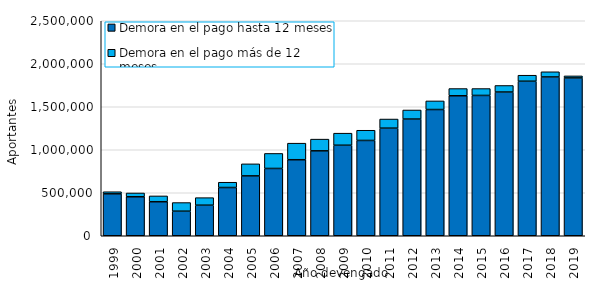
| Category | Demora en el pago hasta 12 meses | Demora en el pago más de 12 meses |
|---|---|---|
| 1999.0 | 487629 | 24284 |
| 2000.0 | 453455 | 43841 |
| 2001.0 | 395644 | 67614 |
| 2002.0 | 285472 | 100591 |
| 2003.0 | 355516 | 87523 |
| 2004.0 | 561027 | 61353 |
| 2005.0 | 696289 | 139739 |
| 2006.0 | 782437 | 174741 |
| 2007.0 | 883974 | 192558 |
| 2008.0 | 987323 | 136351 |
| 2009.0 | 1052552 | 140322 |
| 2010.0 | 1108255 | 118491 |
| 2011.0 | 1251129 | 106173 |
| 2012.0 | 1356923 | 105333 |
| 2013.0 | 1467801 | 100082 |
| 2014.0 | 1627865 | 83951 |
| 2015.0 | 1631687 | 79996 |
| 2016.0 | 1671205 | 76113 |
| 2017.0 | 1796779 | 69975 |
| 2018.0 | 1846551 | 60188 |
| 2019.0 | 1835275 | 23448 |